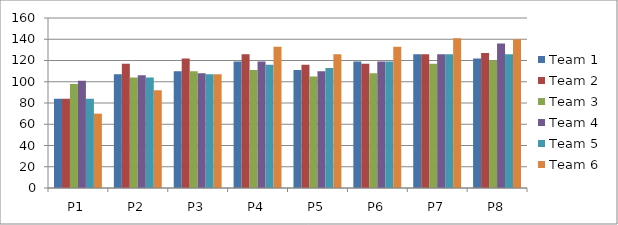
| Category | Team 1 | Team 2 | Team 3 | Team 4 | Team 5 | Team 6 |
|---|---|---|---|---|---|---|
| P1 | 84 | 84 | 98 | 101 | 84 | 70 |
| P2 | 107 | 117 | 104 | 106 | 104 | 92 |
| P3 | 110 | 122 | 110 | 108 | 107 | 107 |
| P4 | 119 | 126 | 111 | 119 | 116 | 133 |
| P5 | 111 | 116 | 105 | 110 | 113 | 126 |
| P6 | 119 | 117 | 108 | 119 | 119 | 133 |
| P7 | 126 | 126 | 117 | 126 | 126 | 141 |
| P8 | 122 | 127 | 120 | 136 | 126 | 140 |